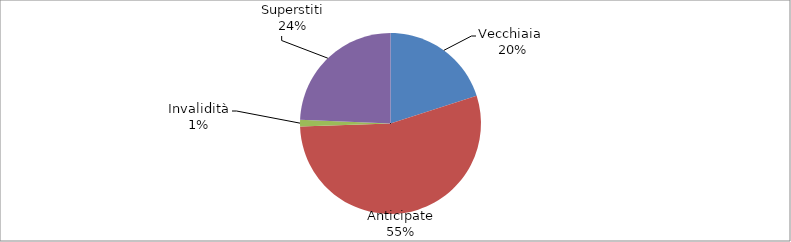
| Category | Series 0 |
|---|---|
| Vecchiaia  | 3791 |
| Anticipate | 10287 |
| Invalidità | 225 |
| Superstiti | 4602 |